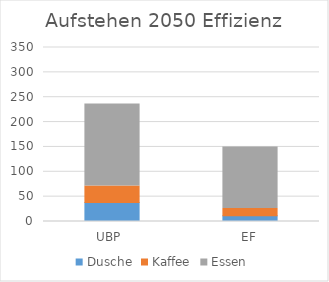
| Category | Dusche | Kaffee | Essen |
|---|---|---|---|
| UBP  | 38.231 | 33.364 | 164.71 |
| EF | 11.72 | 14.457 | 123.674 |